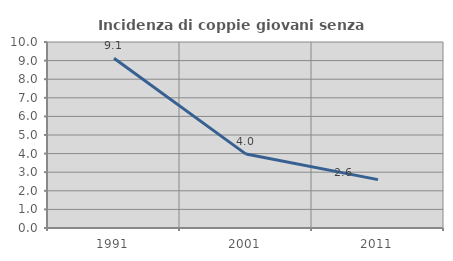
| Category | Incidenza di coppie giovani senza figli |
|---|---|
| 1991.0 | 9.123 |
| 2001.0 | 3.974 |
| 2011.0 | 2.602 |